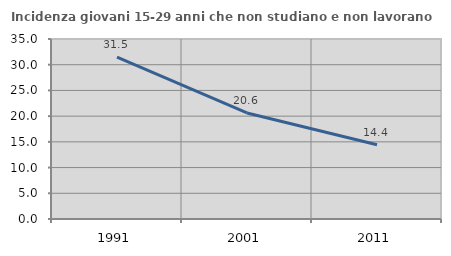
| Category | Incidenza giovani 15-29 anni che non studiano e non lavorano  |
|---|---|
| 1991.0 | 31.472 |
| 2001.0 | 20.619 |
| 2011.0 | 14.444 |